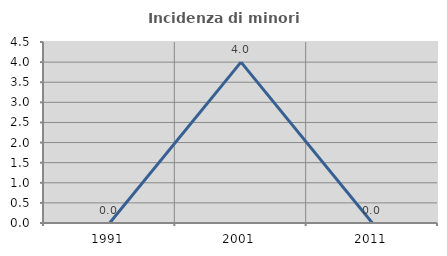
| Category | Incidenza di minori stranieri |
|---|---|
| 1991.0 | 0 |
| 2001.0 | 4 |
| 2011.0 | 0 |